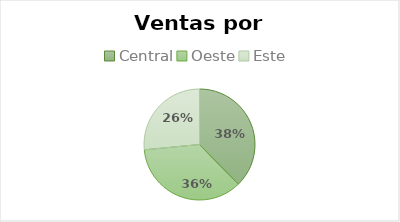
| Category | Total |
|---|---|
| Central | 90295 |
| Oeste | 85683 |
| Este | 63555 |